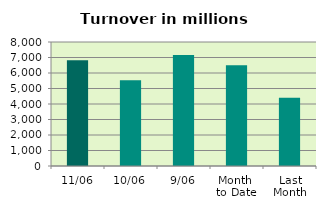
| Category | Series 0 |
|---|---|
| 11/06 | 6814.969 |
| 10/06 | 5531.014 |
| 9/06 | 7160.745 |
| Month 
to Date | 6505.458 |
| Last
Month | 4406.275 |